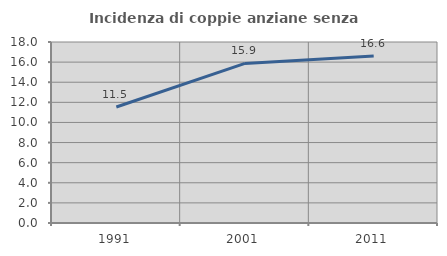
| Category | Incidenza di coppie anziane senza figli  |
|---|---|
| 1991.0 | 11.538 |
| 2001.0 | 15.868 |
| 2011.0 | 16.604 |